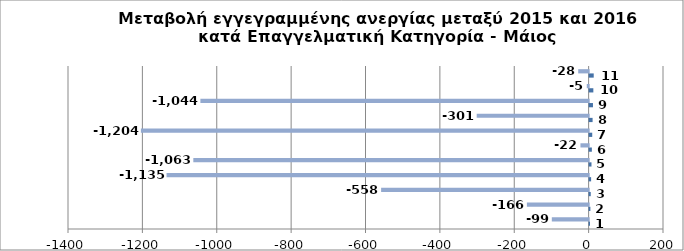
| Category | Series 0 | Series 1 |
|---|---|---|
| 0 | 1 | -99 |
| 1 | 2 | -166 |
| 2 | 3 | -558 |
| 3 | 4 | -1135 |
| 4 | 5 | -1063 |
| 5 | 6 | -22 |
| 6 | 7 | -1204 |
| 7 | 8 | -301 |
| 8 | 9 | -1044 |
| 9 | 10 | -5 |
| 10 | 11 | -28 |